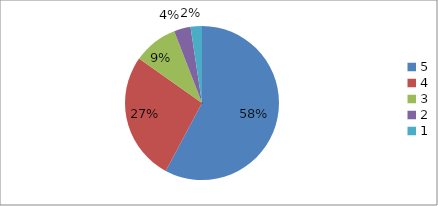
| Category | Series 0 | Series 1 |
|---|---|---|
| 5.0 | 58.1 | 58.1 |
| 4.0 | 27.1 | 27.1 |
| 3.0 | 9.4 | 9.4 |
| 2.0 | 3.5 | 3.5 |
| 1.0 | 2.4 | 2.4 |